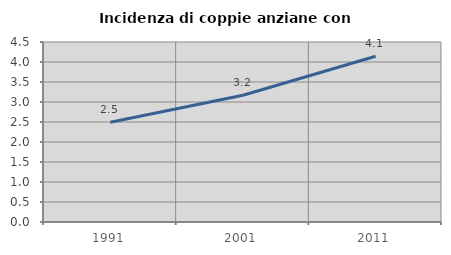
| Category | Incidenza di coppie anziane con figli |
|---|---|
| 1991.0 | 2.494 |
| 2001.0 | 3.168 |
| 2011.0 | 4.145 |